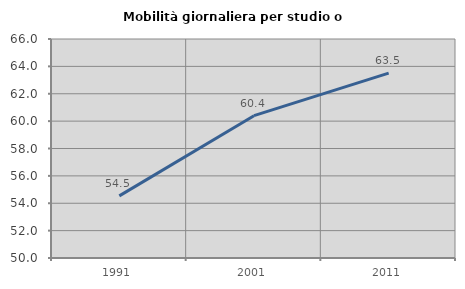
| Category | Mobilità giornaliera per studio o lavoro |
|---|---|
| 1991.0 | 54.539 |
| 2001.0 | 60.398 |
| 2011.0 | 63.51 |